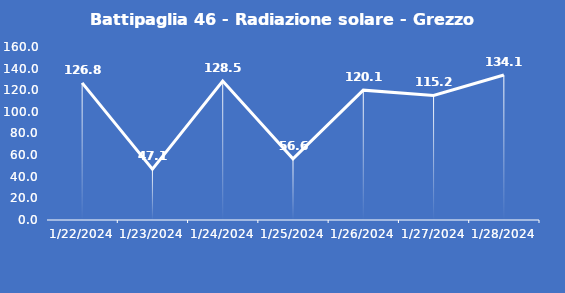
| Category | Battipaglia 46 - Radiazione solare - Grezzo (W/m2) |
|---|---|
| 1/22/24 | 126.8 |
| 1/23/24 | 47.1 |
| 1/24/24 | 128.5 |
| 1/25/24 | 56.6 |
| 1/26/24 | 120.1 |
| 1/27/24 | 115.2 |
| 1/28/24 | 134.1 |